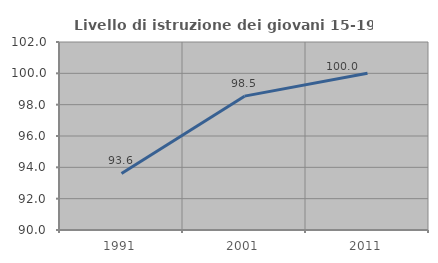
| Category | Livello di istruzione dei giovani 15-19 anni |
|---|---|
| 1991.0 | 93.609 |
| 2001.0 | 98.544 |
| 2011.0 | 100 |